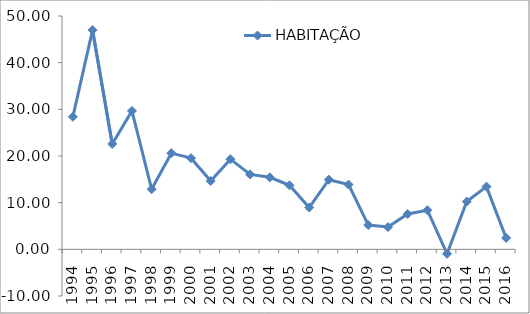
| Category | HABITAÇÃO |
|---|---|
| 1994.0 | 28.401 |
| 1995.0 | 46.972 |
| 1996.0 | 22.575 |
| 1997.0 | 29.66 |
| 1998.0 | 12.88 |
| 1999.0 | 20.607 |
| 2000.0 | 19.535 |
| 2001.0 | 14.642 |
| 2002.0 | 19.317 |
| 2003.0 | 16.048 |
| 2004.0 | 15.431 |
| 2005.0 | 13.712 |
| 2006.0 | 8.955 |
| 2007.0 | 14.927 |
| 2008.0 | 13.873 |
| 2009.0 | 5.2 |
| 2010.0 | 4.77 |
| 2011.0 | 7.573 |
| 2012.0 | 8.395 |
| 2013.0 | -0.965 |
| 2014.0 | 10.238 |
| 2015.0 | 13.437 |
| 2016.0 | 2.442 |